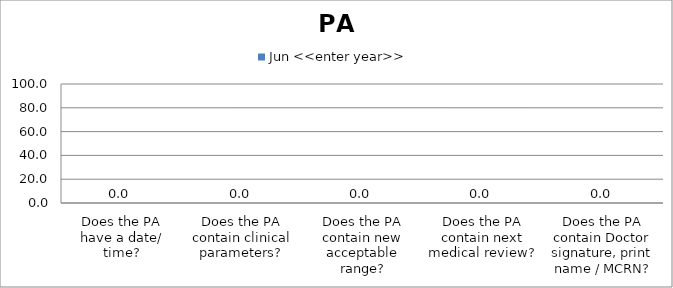
| Category | Jun <<enter year>> |
|---|---|
| Does the PA have a date/ time? | 0 |
| Does the PA contain clinical parameters? | 0 |
| Does the PA contain new acceptable range? | 0 |
| Does the PA contain next medical review? | 0 |
| Does the PA contain Doctor signature, print name / MCRN? | 0 |